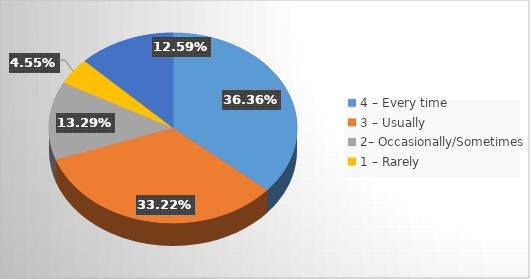
| Category | Series 0 |
|---|---|
| 4 – Every time   | 0.364 |
| 3 – Usually    | 0.332 |
| 2– Occasionally/Sometimes   | 0.133 |
| 1 – Rarely    | 0.046 |
| 0 – I don’t have a mentor | 0.126 |